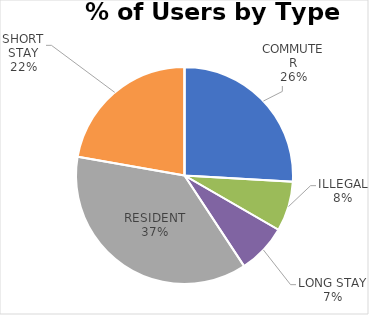
| Category | GROVE ROAD |
|---|---|
| COMMUTER | 7 |
| ILLEGAL | 2 |
| LONG STAY | 2 |
| RESIDENT | 10 |
| SHORT STAY | 6 |
| DISABLED | 0 |
| OTHER | 0 |